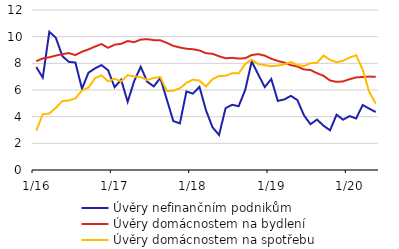
| Category | Úvěry nefinančním podnikům | Úvěry domácnostem na bydlení | Úvěry domácnostem na spotřebu |
|---|---|---|---|
|  1/16 | 7.719 | 8.163 | 2.96 |
| 2 | 6.928 | 8.368 | 4.184 |
| 3 | 10.362 | 8.454 | 4.237 |
| 4 | 9.918 | 8.583 | 4.663 |
| 5 | 8.537 | 8.692 | 5.171 |
| 6 | 8.109 | 8.768 | 5.214 |
| 7 | 8.057 | 8.617 | 5.377 |
| 8 | 6.09 | 8.871 | 5.965 |
| 9 | 7.299 | 9.044 | 6.179 |
| 10 | 7.625 | 9.26 | 6.887 |
| 11 | 7.866 | 9.446 | 7.103 |
| 12 | 7.485 | 9.166 | 6.655 |
|  1/17 | 6.213 | 9.397 | 6.847 |
| 2 | 6.765 | 9.463 | 6.648 |
| 3 | 5.115 | 9.671 | 7.111 |
| 4 | 6.673 | 9.588 | 7.018 |
| 5 | 7.74 | 9.782 | 6.965 |
| 6 | 6.618 | 9.815 | 6.745 |
| 7 | 6.269 | 9.74 | 6.909 |
| 8 | 6.902 | 9.729 | 6.978 |
| 9 | 5.281 | 9.537 | 5.921 |
| 10 | 3.669 | 9.308 | 5.949 |
| 11 | 3.496 | 9.188 | 6.133 |
| 12 | 5.891 | 9.094 | 6.528 |
|  1/18 | 5.728 | 9.059 | 6.772 |
| 2 | 6.234 | 8.964 | 6.704 |
| 3 | 4.475 | 8.76 | 6.263 |
| 4 | 3.204 | 8.718 | 6.82 |
| 5 | 2.625 | 8.532 | 7.051 |
| 6 | 4.638 | 8.379 | 7.065 |
| 7 | 4.89 | 8.413 | 7.26 |
| 8 | 4.785 | 8.355 | 7.247 |
| 9 | 5.993 | 8.384 | 7.95 |
| 10 | 8.137 | 8.622 | 8.271 |
| 11 | 7.165 | 8.691 | 7.942 |
| 12 | 6.217 | 8.578 | 7.867 |
|  1/19 | 6.825 | 8.341 | 7.783 |
| 2 | 5.184 | 8.179 | 7.832 |
| 3 | 5.293 | 8.052 | 7.921 |
| 4 | 5.561 | 7.865 | 8.096 |
| 5 | 5.245 | 7.758 | 7.872 |
| 6 | 4.106 | 7.542 | 7.8 |
| 7 | 3.433 | 7.497 | 8.014 |
| 8 | 3.78 | 7.263 | 8.026 |
| 9 | 3.328 | 7.065 | 8.582 |
| 10 | 2.975 | 6.712 | 8.265 |
| 11 | 4.148 | 6.61 | 8.079 |
| 12 | 3.774 | 6.644 | 8.193 |
|  1/20 | 4.044 | 6.808 | 8.429 |
| 2 | 3.864 | 6.944 | 8.607 |
| 3 | 4.875 | 6.98 | 7.526 |
| 4 | 4.604 | 7.006 | 5.865 |
| 5 | 4.349 | 6.993 | 4.976 |